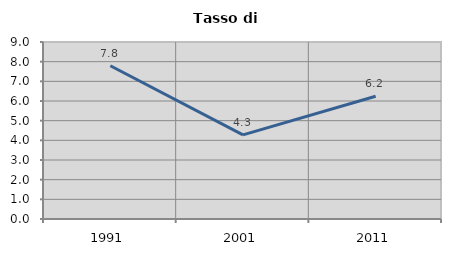
| Category | Tasso di disoccupazione   |
|---|---|
| 1991.0 | 7.792 |
| 2001.0 | 4.279 |
| 2011.0 | 6.241 |